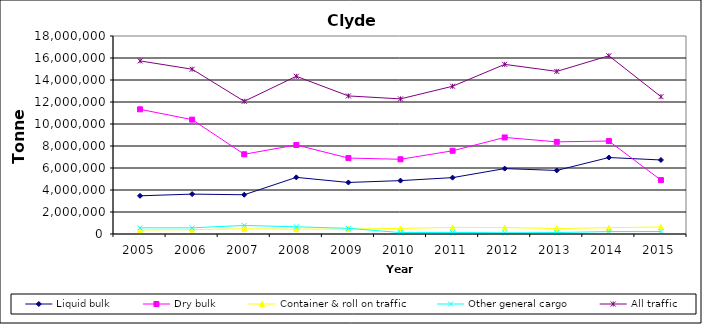
| Category | Liquid bulk | Dry bulk | Container & roll on traffic | Other general cargo | All traffic |
|---|---|---|---|---|---|
| 2005.0 | 3473000 | 11334000 | 370000 | 560000 | 15737000 |
| 2006.0 | 3626000 | 10397000 | 398000 | 560000 | 14981000 |
| 2007.0 | 3568000 | 7249000 | 469000 | 777000 | 12063000 |
| 2008.0 | 5149000 | 8095000 | 439000 | 654000 | 14338000 |
| 2009.0 | 4685485 | 6904211 | 446748 | 515680 | 12552124 |
| 2010.0 | 4853000 | 6793000 | 509000 | 128000 | 12283000 |
| 2011.0 | 5124000 | 7564000 | 599000 | 144000 | 13431000 |
| 2012.0 | 5945000 | 8778000 | 588000 | 109000 | 15421000 |
| 2013.0 | 5777000 | 8377000 | 499000 | 130000 | 14783000 |
| 2014.0 | 6952000 | 8451000 | 576000 | 221000 | 16201000 |
| 2015.0 | 6729000 | 4899000 | 634000 | 223000 | 12484000 |